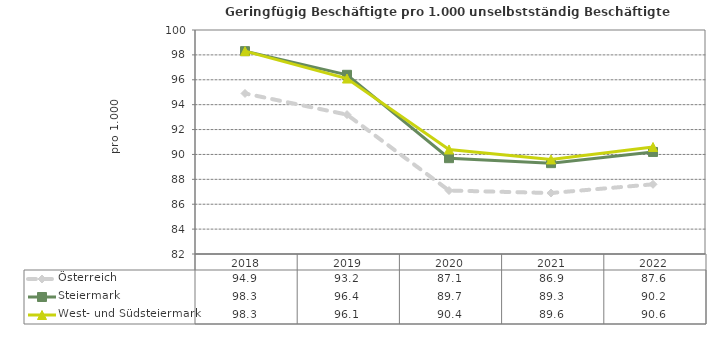
| Category | Österreich | Steiermark | West- und Südsteiermark |
|---|---|---|---|
| 2022.0 | 87.6 | 90.2 | 90.6 |
| 2021.0 | 86.9 | 89.3 | 89.6 |
| 2020.0 | 87.1 | 89.7 | 90.4 |
| 2019.0 | 93.2 | 96.4 | 96.1 |
| 2018.0 | 94.9 | 98.3 | 98.3 |